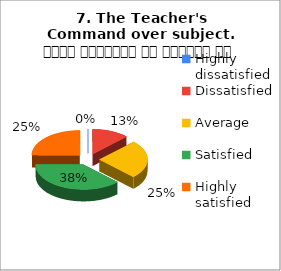
| Category | 7. The Teacher's Command over subject. विषय अवधारणा पर शिक्षक का ज्ञान |
|---|---|
| Highly dissatisfied | 0 |
| Dissatisfied | 1 |
| Average | 2 |
| Satisfied | 3 |
| Highly satisfied | 2 |